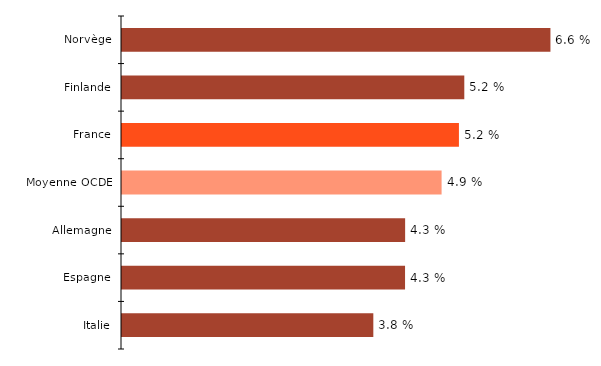
| Category | Series 0 |
|---|---|
| Italie | 3.85 |
| Espagne | 4.336 |
| Allemagne | 4.337 |
| Moyenne OCDE | 4.895 |
| France | 5.161 |
| Finlande | 5.243 |
| Norvège | 6.563 |